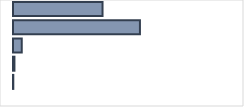
| Category | Series 0 |
|---|---|
| 0 | 39.44 |
| 1 | 55.919 |
| 2 | 3.871 |
| 3 | 0.635 |
| 4 | 0.134 |